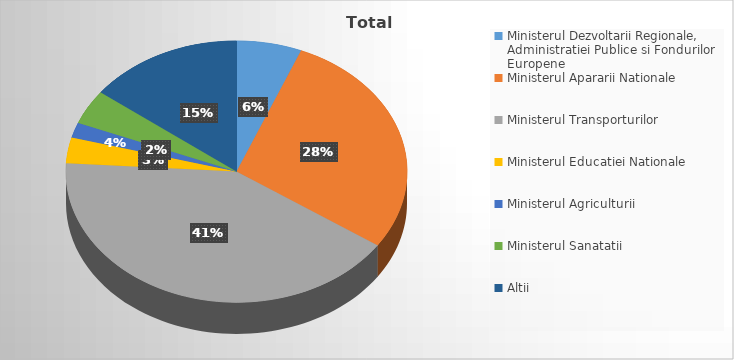
| Category | Series 0 |
|---|---|
| Ministerul Dezvoltarii Regionale, Administratiei Publice si Fondurilor Europene | 6.167 |
| Ministerul Apararii Nationale | 28.358 |
| Ministerul Transporturilor | 41.481 |
| Ministerul Educatiei Nationale | 3.189 |
| Ministerul Agriculturii | 1.89 |
| Ministerul Sanatatii | 4.268 |
| Altii | 14.647 |